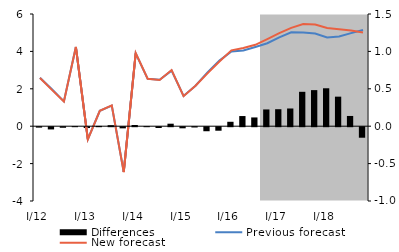
| Category | Differences |
|---|---|
| I/12 | -0.006 |
| II | -0.03 |
| III | -0.008 |
| IV | 0.001 |
| I/13 | -0.011 |
| II | 0.004 |
| III | 0.014 |
| IV | -0.015 |
| I/14 | 0.016 |
| II | 0.001 |
| III | -0.011 |
| IV | 0.033 |
| I/15 | -0.015 |
| II | -0.004 |
| III | -0.054 |
| IV | -0.047 |
| I/16 | 0.059 |
| II | 0.136 |
| III | 0.117 |
| IV | 0.224 |
| I/17 | 0.227 |
| II | 0.237 |
| III | 0.46 |
| IV | 0.482 |
| I/18 | 0.507 |
| II | 0.395 |
| III | 0.137 |
| IV | -0.141 |